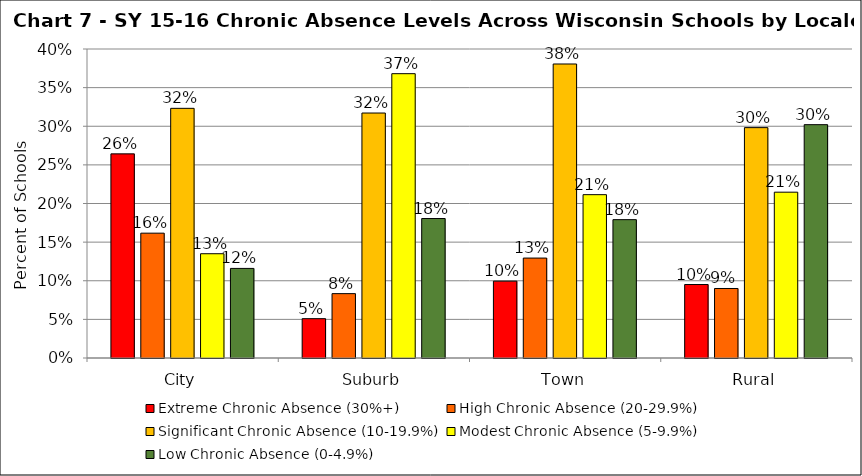
| Category | Extreme Chronic Absence (30%+) | High Chronic Absence (20-29.9%) | Significant Chronic Absence (10-19.9%) | Modest Chronic Absence (5-9.9%) | Low Chronic Absence (0-4.9%) |
|---|---|---|---|---|---|
| 0 | 0.264 | 0.162 | 0.323 | 0.135 | 0.116 |
| 1 | 0.051 | 0.083 | 0.317 | 0.368 | 0.181 |
| 2 | 0.1 | 0.129 | 0.381 | 0.211 | 0.179 |
| 3 | 0.095 | 0.09 | 0.298 | 0.215 | 0.302 |